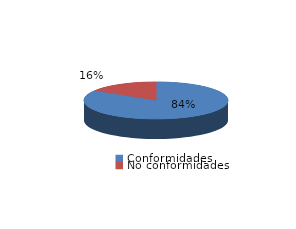
| Category | Series 0 |
|---|---|
| Conformidades | 837 |
| No conformidades | 161 |